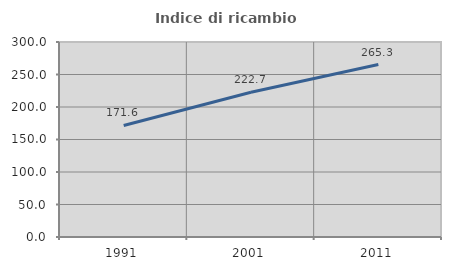
| Category | Indice di ricambio occupazionale  |
|---|---|
| 1991.0 | 171.587 |
| 2001.0 | 222.698 |
| 2011.0 | 265.288 |